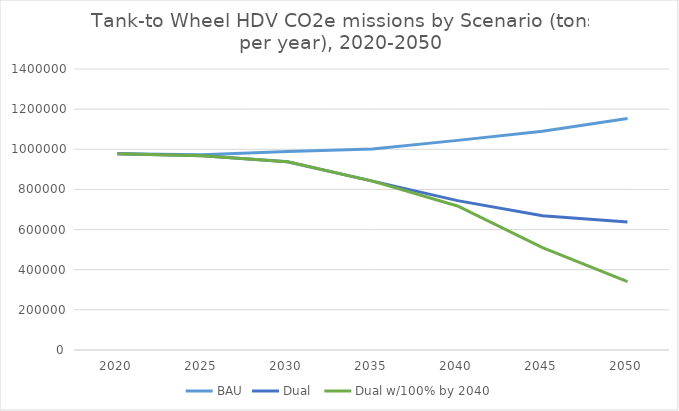
| Category | BAU | Dual  | Dual w/100% by 2040 |
|---|---|---|---|
| 2020.0 | 978101.143 | 978101.143 | 978101.143 |
| 2025.0 | 972578.691 | 968120.71 | 968120.71 |
| 2030.0 | 989485.839 | 938241.575 | 938241.575 |
| 2035.0 | 1001598.013 | 841182.523 | 841182.523 |
| 2040.0 | 1044384.186 | 744194.573 | 717690.504 |
| 2045.0 | 1090233.107 | 669235.51 | 510045.572 |
| 2050.0 | 1153785.594 | 637226.209 | 340548.772 |